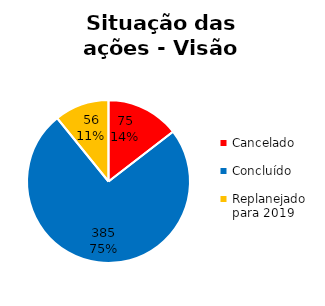
| Category | Total |
|---|---|
| Cancelado | 75 |
| Concluído | 385 |
| Replanejado para 2019 | 56 |